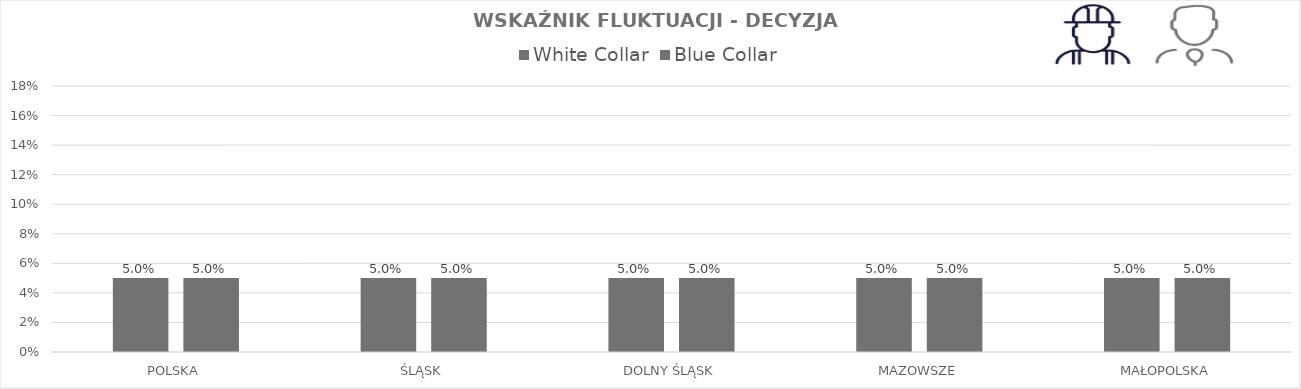
| Category | White Collar | Blue Collar |
|---|---|---|
| POLSKA | 0.05 | 0.05 |
| ŚLĄSK | 0.05 | 0.05 |
| DOLNY ŚLĄSK | 0.05 | 0.05 |
| MAZOWSZE | 0.05 | 0.05 |
| MAŁOPOLSKA | 0.05 | 0.05 |